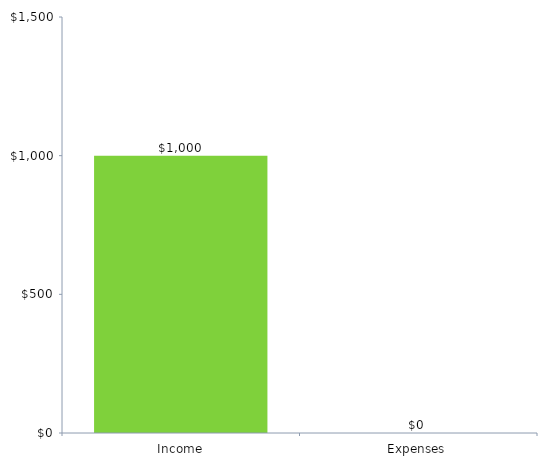
| Category | ChartData |
|---|---|
| 0 | 1000 |
| 1 | 0 |